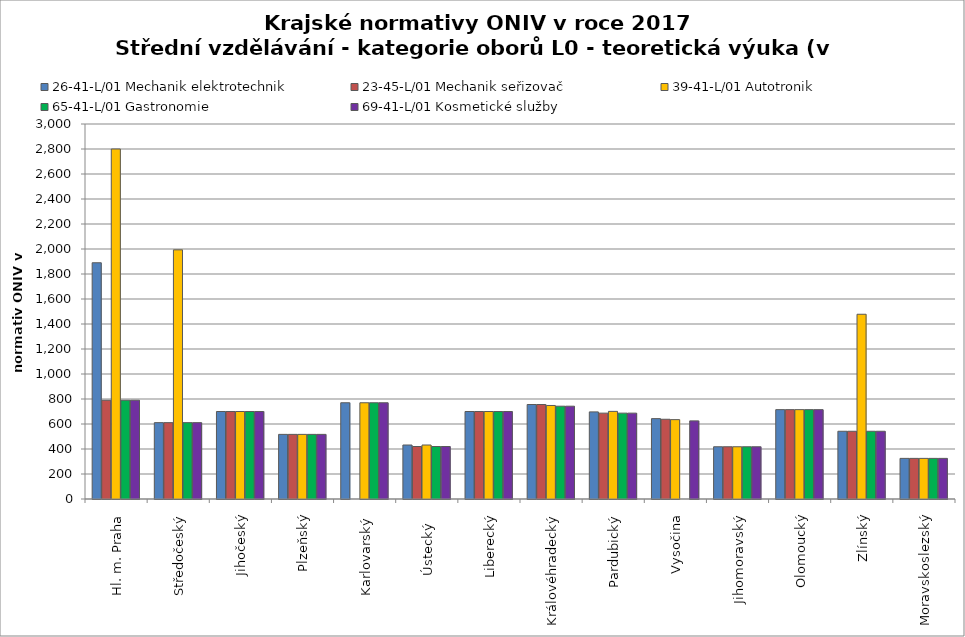
| Category | 26-41-L/01 Mechanik elektrotechnik | 23-45-L/01 Mechanik seřizovač | 39-41-L/01 Autotronik | 65-41-L/01 Gastronomie | 69-41-L/01 Kosmetické služby |
|---|---|---|---|---|---|
| Hl. m. Praha | 1890 | 790 | 2800 | 790 | 790 |
| Středočeský | 610.785 | 610.785 | 1993.32 | 610.785 | 610.785 |
| Jihočeský | 700 | 700 | 700 | 700 | 700 |
| Plzeňský | 517 | 517 | 517 | 517 | 517 |
| Karlovarský  | 770 | 0 | 770 | 770 | 770 |
| Ústecký   | 432 | 420 | 432 | 420 | 420 |
| Liberecký | 700 | 700 | 700 | 700 | 700 |
| Královéhradecký | 755.9 | 755.9 | 748.2 | 742.5 | 742.5 |
| Pardubický | 697 | 687 | 701 | 687 | 687 |
| Vysočina | 643 | 638 | 635 | 0 | 625 |
| Jihomoravský | 418 | 418 | 418 | 418 | 418 |
| Olomoucký | 715 | 715 | 715 | 715 | 715 |
| Zlínský | 542 | 542 | 1478 | 542 | 542 |
| Moravskoslezský | 325 | 325 | 325 | 325 | 325 |